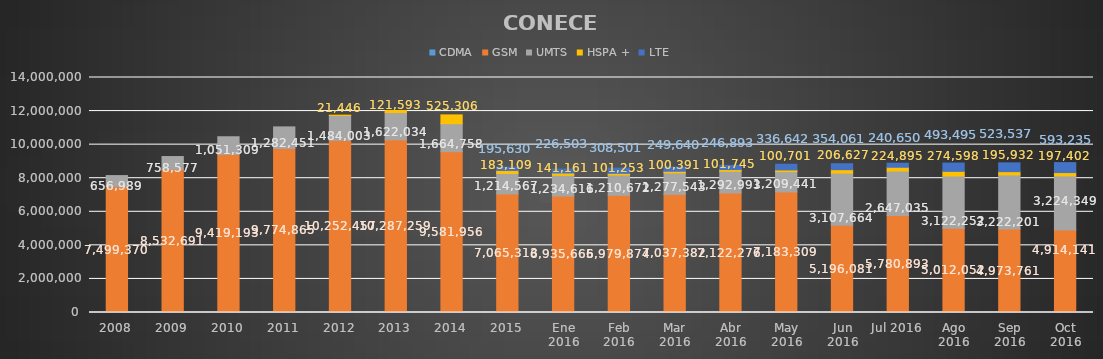
| Category | CDMA | GSM | UMTS | HSPA + | LTE |
|---|---|---|---|---|---|
| 2008 | 0 | 7499370 | 656989 | 0 | 0 |
| 2009 | 0 | 8532691 | 758577 | 0 | 0 |
| 2010 | 0 | 9419193 | 1051309 | 0 | 0 |
| 2011 | 0 | 9774865 | 1282451 | 0 | 0 |
| 2012 | 0 | 10252457 | 1484003 | 21446 | 0 |
| 2013 | 0 | 10287259 | 1622034 | 121593 | 0 |
| 2014 | 0 | 9581956 | 1664758 | 525306 | 0 |
| 2015 | 0 | 7065313 | 1214567 | 183109 | 195630 |
| Ene 2016 | 0 | 6935665 | 1234616 | 141161 | 226503 |
| Feb 2016 | 0 | 6979874 | 1210672 | 101253 | 308501 |
| Mar 2016 | 0 | 7037382 | 1277543 | 100391 | 249640 |
| Abr 2016 | 0 | 7122276 | 1292993 | 101745 | 246893 |
| May 2016 | 0 | 7183309 | 1209441 | 100701 | 336642 |
| Jun 2016 | 0 | 5196081 | 3107664 | 206627 | 354061 |
| Jul 2016 | 0 | 5780893 | 2647035 | 224895 | 240650 |
| Ago 2016 | 0 | 5012052 | 3122252 | 274598 | 493495 |
| Sep 2016 | 0 | 4973761 | 3222201 | 195932 | 523537 |
| Oct 2016 | 0 | 4914141 | 3224349 | 197402 | 593235 |